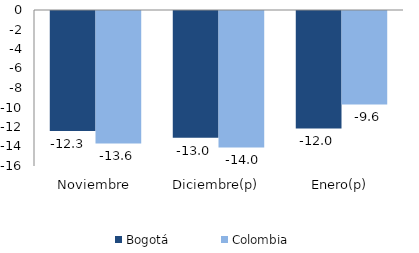
| Category | Bogotá | Colombia |
|---|---|---|
| Noviembre | -12.318 | -13.58 |
| Diciembre(p) | -13 | -13.99 |
| Enero(p) | -12.041 | -9.586 |